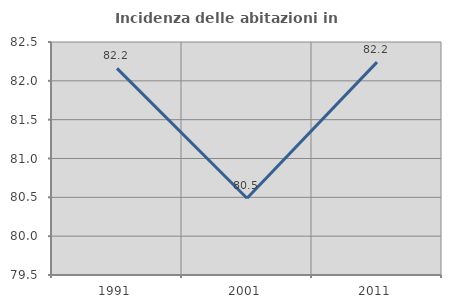
| Category | Incidenza delle abitazioni in proprietà  |
|---|---|
| 1991.0 | 82.16 |
| 2001.0 | 80.488 |
| 2011.0 | 82.24 |